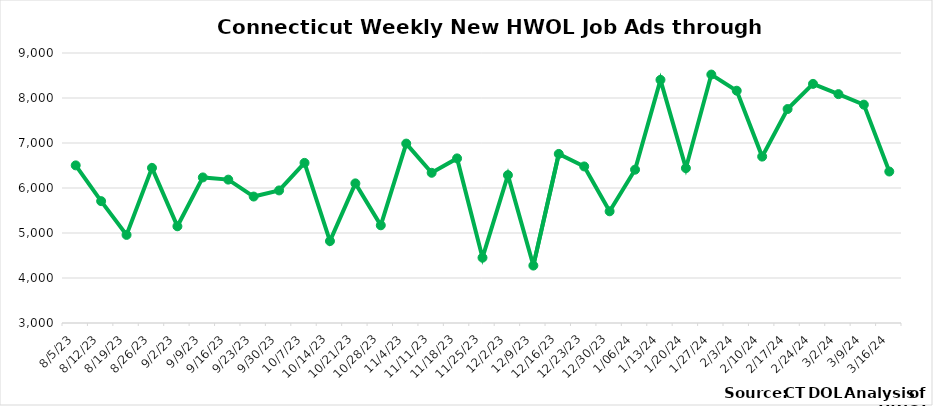
| Category | Connecticut |
|---|---|
| 8/5/23 | 6503 |
| 8/12/23 | 5708 |
| 8/19/23 | 4958 |
| 8/26/23 | 6447 |
| 9/2/23 | 5149 |
| 9/9/23 | 6235 |
| 9/16/23 | 6186 |
| 9/23/23 | 5810 |
| 9/30/23 | 5946 |
| 10/7/23 | 6558 |
| 10/14/23 | 4820 |
| 10/21/23 | 6103 |
| 10/28/23 | 5171 |
| 11/4/23 | 6987 |
| 11/11/23 | 6338 |
| 11/18/23 | 6658 |
| 11/25/23 | 4451 |
| 12/2/23 | 6286 |
| 12/9/23 | 4276 |
| 12/16/23 | 6757 |
|  12/23/23 | 6479 |
|  12/30/23 | 5482 |
|  1/06/24 | 6407 |
|  1/13/24 | 8403 |
|  1/20/24 | 6441 |
|  1/27/24 | 8521 |
|  2/3/24 | 8162 |
|  2/10/24 | 6698 |
|  2/17/24 | 7755 |
|  2/24/24 | 8314 |
|  3/2/24 | 8086 |
|  3/9/24 | 7852 |
|  3/16/24 | 6366 |